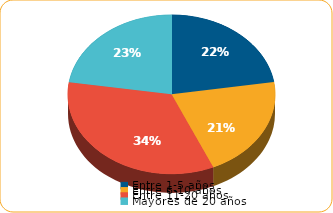
| Category | Series 0 |
|---|---|
| Entre 1-5 años | 3179.2 |
| Entre 6-10 años | 2956.8 |
| Entre 11-20 años | 4813 |
| Mayores de 20 años | 3186.1 |